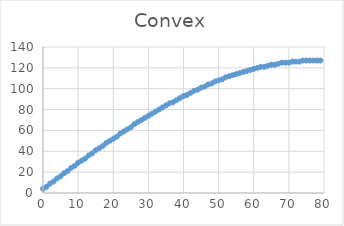
| Category | Series 0 |
|---|---|
| 0.0 | 4 |
| 1.0 | 6 |
| 2.0 | 9 |
| 3.0 | 11 |
| 4.0 | 14 |
| 5.0 | 16 |
| 6.0 | 19 |
| 7.0 | 21 |
| 8.0 | 24 |
| 9.0 | 26 |
| 10.0 | 29 |
| 11.0 | 31 |
| 12.0 | 33 |
| 13.0 | 36 |
| 14.0 | 38 |
| 15.0 | 41 |
| 16.0 | 43 |
| 17.0 | 45 |
| 18.0 | 48 |
| 19.0 | 50 |
| 20.0 | 52 |
| 21.0 | 54 |
| 22.0 | 57 |
| 23.0 | 59 |
| 24.0 | 61 |
| 25.0 | 63 |
| 26.0 | 66 |
| 27.0 | 68 |
| 28.0 | 70 |
| 29.0 | 72 |
| 30.0 | 74 |
| 31.0 | 76 |
| 32.0 | 78 |
| 33.0 | 80 |
| 34.0 | 82 |
| 35.0 | 84 |
| 36.0 | 86 |
| 37.0 | 87 |
| 38.0 | 89 |
| 39.0 | 91 |
| 40.0 | 93 |
| 41.0 | 94 |
| 42.0 | 96 |
| 43.0 | 98 |
| 44.0 | 99 |
| 45.0 | 101 |
| 46.0 | 102 |
| 47.0 | 104 |
| 48.0 | 105 |
| 49.0 | 107 |
| 50.0 | 108 |
| 51.0 | 109 |
| 52.0 | 111 |
| 53.0 | 112 |
| 54.0 | 113 |
| 55.0 | 114 |
| 56.0 | 115 |
| 57.0 | 116 |
| 58.0 | 117 |
| 59.0 | 118 |
| 60.0 | 119 |
| 61.0 | 120 |
| 62.0 | 121 |
| 63.0 | 121 |
| 64.0 | 122 |
| 65.0 | 123 |
| 66.0 | 123 |
| 67.0 | 124 |
| 68.0 | 125 |
| 69.0 | 125 |
| 70.0 | 125 |
| 71.0 | 126 |
| 72.0 | 126 |
| 73.0 | 126 |
| 74.0 | 127 |
| 75.0 | 127 |
| 76.0 | 127 |
| 77.0 | 127 |
| 78.0 | 127 |
| 79.0 | 127 |